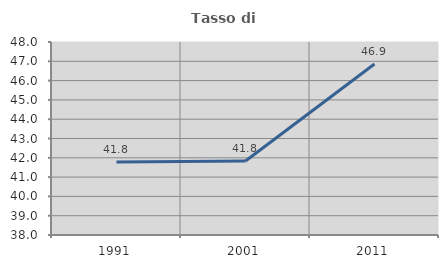
| Category | Tasso di occupazione   |
|---|---|
| 1991.0 | 41.781 |
| 2001.0 | 41.835 |
| 2011.0 | 46.862 |